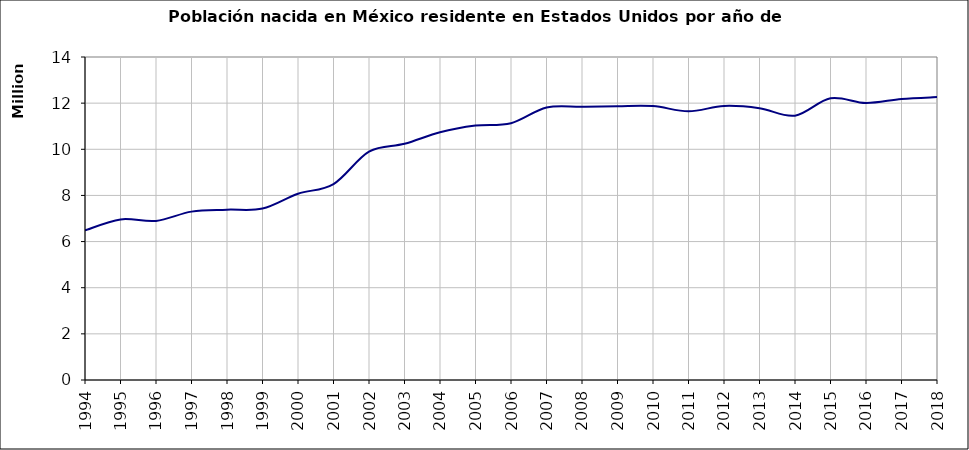
| Category | Habitantes en EU nacidos en México |
|---|---|
| 1994.0 | 6485252.69 |
| 1995.0 | 6960894.94 |
| 1996.0 | 6894787.8 |
| 1997.0 | 7298244.25 |
| 1998.0 | 7382352.3 |
| 1999.0 | 7429126.55 |
| 2000.0 | 8072288.08 |
| 2001.0 | 8494016 |
| 2002.0 | 9900414 |
| 2003.0 | 10237189 |
| 2004.0 | 10739692 |
| 2005.0 | 11026774 |
| 2006.0 | 11132120.8 |
| 2007.0 | 11811731.77 |
| 2008.0 | 11845293.67 |
| 2009.0 | 11869486.75 |
| 2010.0 | 11872688.85 |
| 2011.0 | 11644423 |
| 2012.0 | 11877703 |
| 2013.0 | 11778922 |
| 2014.0 | 11458134 |
| 2015.0 | 12211129 |
| 2016.0 | 12006942 |
| 2017.0 | 12181388 |
| 2018.0 | 12263311 |